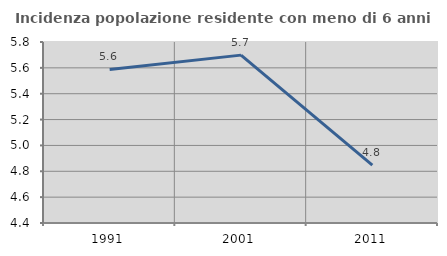
| Category | Incidenza popolazione residente con meno di 6 anni |
|---|---|
| 1991.0 | 5.588 |
| 2001.0 | 5.699 |
| 2011.0 | 4.847 |